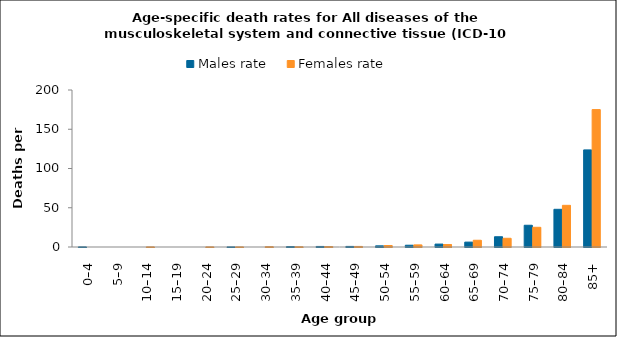
| Category | Males rate | Females rate |
|---|---|---|
| 0–4 | 0.129 | 0 |
| 5–9 | 0 | 0 |
| 10–14 | 0 | 0.126 |
| 15–19 | 0 | 0 |
| 20–24 | 0 | 0.126 |
| 25–29 | 0.108 | 0.111 |
| 30–34 | 0 | 0.413 |
| 35–39 | 0.532 | 0.314 |
| 40–44 | 0.713 | 0.579 |
| 45–49 | 0.747 | 0.732 |
| 50–54 | 1.474 | 1.905 |
| 55–59 | 2.253 | 2.691 |
| 60–64 | 3.721 | 3.129 |
| 65–69 | 6.217 | 8.585 |
| 70–74 | 13.063 | 11.116 |
| 75–79 | 27.707 | 25.101 |
| 80–84 | 48.024 | 53.082 |
| 85+ | 123.715 | 175.037 |